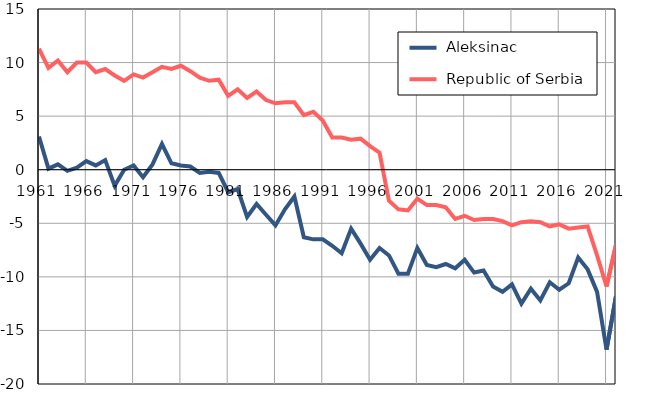
| Category |  Aleksinac |  Republic of Serbia |
|---|---|---|
| 1961.0 | 3.1 | 11.3 |
| 1962.0 | 0.1 | 9.5 |
| 1963.0 | 0.5 | 10.2 |
| 1964.0 | -0.1 | 9.1 |
| 1965.0 | 0.2 | 10 |
| 1966.0 | 0.8 | 10 |
| 1967.0 | 0.4 | 9.1 |
| 1968.0 | 0.9 | 9.4 |
| 1969.0 | -1.5 | 8.8 |
| 1970.0 | 0 | 8.3 |
| 1971.0 | 0.4 | 8.9 |
| 1972.0 | -0.7 | 8.6 |
| 1973.0 | 0.5 | 9.1 |
| 1974.0 | 2.4 | 9.6 |
| 1975.0 | 0.6 | 9.4 |
| 1976.0 | 0.4 | 9.7 |
| 1977.0 | 0.3 | 9.2 |
| 1978.0 | -0.3 | 8.6 |
| 1979.0 | -0.2 | 8.3 |
| 1980.0 | -0.3 | 8.4 |
| 1981.0 | -2.1 | 6.9 |
| 1982.0 | -1.8 | 7.5 |
| 1983.0 | -4.4 | 6.7 |
| 1984.0 | -3.2 | 7.3 |
| 1985.0 | -4.2 | 6.5 |
| 1986.0 | -5.2 | 6.2 |
| 1987.0 | -3.7 | 6.3 |
| 1988.0 | -2.5 | 6.3 |
| 1989.0 | -6.3 | 5.1 |
| 1990.0 | -6.5 | 5.4 |
| 1991.0 | -6.5 | 4.6 |
| 1992.0 | -7.1 | 3 |
| 1993.0 | -7.8 | 3 |
| 1994.0 | -5.5 | 2.8 |
| 1995.0 | -6.9 | 2.9 |
| 1996.0 | -8.4 | 2.2 |
| 1997.0 | -7.3 | 1.6 |
| 1998.0 | -8 | -2.9 |
| 1999.0 | -9.7 | -3.7 |
| 2000.0 | -9.7 | -3.8 |
| 2001.0 | -7.3 | -2.7 |
| 2002.0 | -8.9 | -3.3 |
| 2003.0 | -9.1 | -3.3 |
| 2004.0 | -8.8 | -3.5 |
| 2005.0 | -9.2 | -4.6 |
| 2006.0 | -8.4 | -4.3 |
| 2007.0 | -9.6 | -4.7 |
| 2008.0 | -9.4 | -4.6 |
| 2009.0 | -10.9 | -4.6 |
| 2010.0 | -11.4 | -4.8 |
| 2011.0 | -10.7 | -5.2 |
| 2012.0 | -12.5 | -4.9 |
| 2013.0 | -11.1 | -4.8 |
| 2014.0 | -12.2 | -4.9 |
| 2015.0 | -10.5 | -5.3 |
| 2016.0 | -11.2 | -5.1 |
| 2017.0 | -10.6 | -5.5 |
| 2018.0 | -8.2 | -5.4 |
| 2019.0 | -9.3 | -5.3 |
| 2020.0 | -11.4 | -8 |
| 2021.0 | -16.8 | -10.9 |
| 2022.0 | -11.8 | -7 |